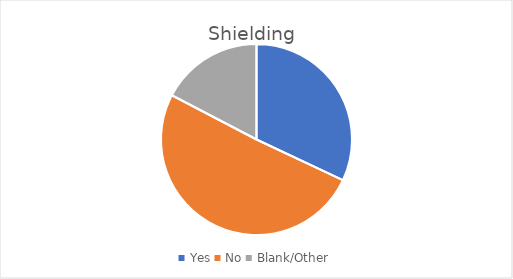
| Category | Series 0 |
|---|---|
| Yes | 24 |
| No | 38 |
| Blank/Other | 13 |